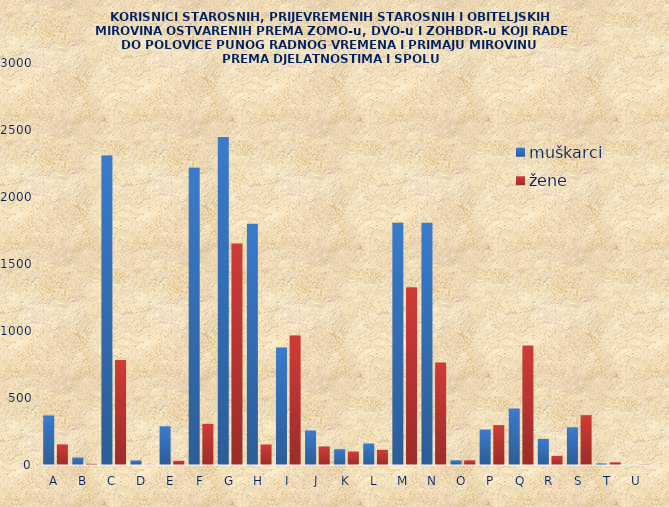
| Category | muškarci | žene |
|---|---|---|
| A | 370 | 154 |
| B | 55 | 9 |
| C | 2309 | 783 |
| D | 34 | 2 |
| E | 289 | 31 |
| F | 2218 | 307 |
| G | 2448 | 1653 |
| H | 1801 | 153 |
| I | 877 | 966 |
| J | 258 | 138 |
| K | 118 | 100 |
| L | 160 | 113 |
| M | 1807 | 1327 |
| N | 1807 | 765 |
| O | 35 | 35 |
| P | 264 | 298 |
| Q | 421 | 892 |
| R | 195 | 68 |
| S | 281 | 372 |
| T | 11 | 20 |
| U | 1 | 4 |